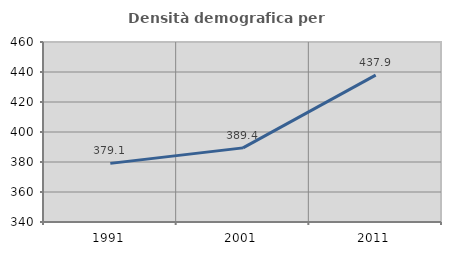
| Category | Densità demografica |
|---|---|
| 1991.0 | 379.083 |
| 2001.0 | 389.415 |
| 2011.0 | 437.944 |